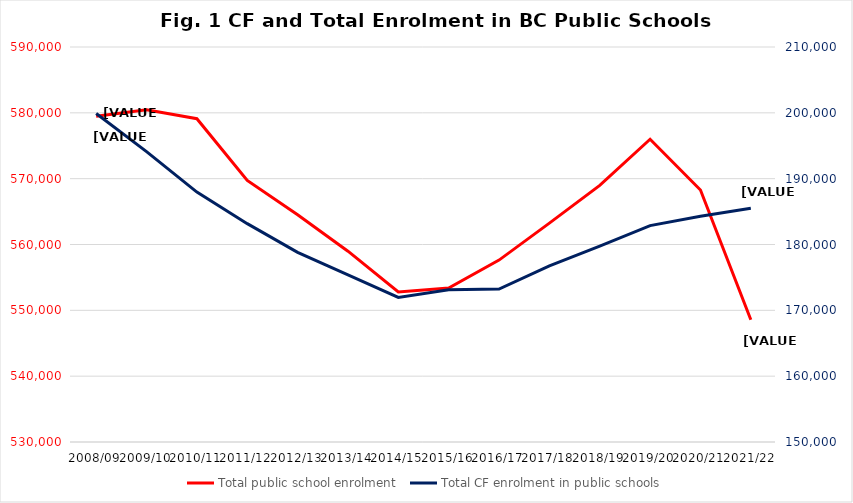
| Category | Total public school enrolment  |
|---|---|
| 2008/09 | 579486 |
| 2009/10 | 580483 |
| 2010/11 | 579112 |
| 2011/12 | 569740 |
| 2012/13 | 564532 |
| 2013/14 | 558985 |
| 2014/15 | 552788 |
| 2015/16 | 553378 |
| 2016/17 | 557630 |
| 2017/18 | 563247 |
| 2018/19 | 568983 |
| 2019/20 | 575986 |
| 2020/21 | 568271 |
| 2021/22 | 548563 |